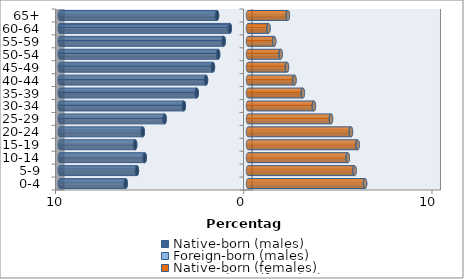
| Category | Native-born (males) | Foreign-born (males) | Native-born (females) | Foreign-born (females) |
|---|---|---|---|---|
| 0-4 | -6.496 | -0.009 | 6.214 | 0.01 |
| 5-9 | -5.9 | -0.011 | 5.655 | 0.011 |
| 10-14 | -5.487 | -0.013 | 5.292 | 0.012 |
| 15-19 | -5.993 | -0.015 | 5.814 | 0.013 |
| 20-24 | -5.589 | -0.016 | 5.463 | 0.014 |
| 25-29 | -4.428 | -0.017 | 4.402 | 0.013 |
| 30-34 | -3.407 | -0.016 | 3.494 | 0.013 |
| 35-39 | -2.721 | -0.015 | 2.905 | 0.011 |
| 40-44 | -2.23 | -0.013 | 2.463 | 0.01 |
| 45-49 | -1.863 | -0.012 | 2.067 | 0.008 |
| 50-54 | -1.586 | -0.01 | 1.729 | 0.007 |
| 55-59 | -1.292 | -0.009 | 1.386 | 0.006 |
| 60-64 | -0.965 | -0.008 | 1.086 | 0.006 |
| 65+ | -1.645 | -0.012 | 2.108 | 0.014 |